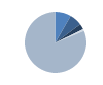
| Category | Series 0 |
|---|---|
| 0 | 66 |
| 1 | 52 |
| 2 | 23 |
| 3 | 8 |
| 4 | 648 |